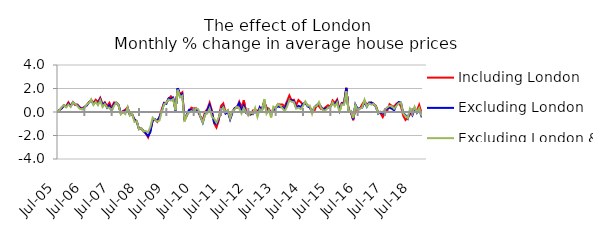
| Category | Including London | Excluding London | Excluding London & SE |
|---|---|---|---|
| 2005-07-01 | 0.004 | -0.027 | 0.069 |
| 2005-08-01 | 0.128 | 0.163 | 0.113 |
| 2005-09-01 | 0.297 | 0.295 | 0.421 |
| 2005-10-01 | 0.584 | 0.545 | 0.585 |
| 2005-11-01 | 0.486 | 0.433 | 0.401 |
| 2005-12-01 | 0.828 | 0.713 | 0.635 |
| 2006-01-01 | 0.509 | 0.504 | 0.432 |
| 2006-02-01 | 0.838 | 0.808 | 0.823 |
| 2006-03-01 | 0.586 | 0.674 | 0.681 |
| 2006-04-01 | 0.628 | 0.563 | 0.509 |
| 2006-05-01 | 0.405 | 0.361 | 0.266 |
| 2006-06-01 | 0.306 | 0.233 | 0.241 |
| 2006-07-01 | 0.429 | 0.392 | 0.321 |
| 2006-08-01 | 0.565 | 0.554 | 0.633 |
| 2006-09-01 | 0.835 | 0.786 | 0.762 |
| 2006-10-01 | 0.993 | 1.028 | 1.077 |
| 2006-11-01 | 0.798 | 0.657 | 0.597 |
| 2006-12-01 | 1.047 | 0.896 | 0.873 |
| 2007-01-01 | 0.861 | 0.675 | 0.579 |
| 2007-02-01 | 1.212 | 1.103 | 1.006 |
| 2007-03-01 | 0.649 | 0.564 | 0.427 |
| 2007-04-01 | 0.826 | 0.759 | 0.678 |
| 2007-05-01 | 0.491 | 0.363 | 0.375 |
| 2007-06-01 | 0.782 | 0.561 | 0.366 |
| 2007-07-01 | 0.32 | 0.1 | 0.07 |
| 2007-08-01 | 0.81 | 0.683 | 0.526 |
| 2007-09-01 | 0.786 | 0.789 | 0.799 |
| 2007-10-01 | 0.574 | 0.623 | 0.585 |
| 2007-11-01 | -0.113 | -0.077 | -0.206 |
| 2007-12-01 | 0.076 | 0.042 | -0.036 |
| 2008-01-01 | 0.196 | 0.057 | -0.181 |
| 2008-02-01 | 0.402 | 0.318 | 0.4 |
| 2008-03-01 | -0.271 | -0.253 | -0.302 |
| 2008-04-01 | -0.188 | -0.2 | -0.142 |
| 2008-05-01 | -0.619 | -0.654 | -0.845 |
| 2008-06-01 | -0.782 | -0.813 | -0.776 |
| 2008-07-01 | -1.451 | -1.459 | -1.469 |
| 2008-08-01 | -1.382 | -1.399 | -1.373 |
| 2008-09-01 | -1.671 | -1.607 | -1.657 |
| 2008-10-01 | -1.826 | -1.814 | -1.615 |
| 2008-11-01 | -2.159 | -2.057 | -1.722 |
| 2008-12-01 | -1.562 | -1.704 | -1.276 |
| 2009-01-01 | -0.738 | -0.696 | -0.476 |
| 2009-02-01 | -0.617 | -0.629 | -0.663 |
| 2009-03-01 | -0.835 | -0.775 | -0.813 |
| 2009-04-01 | -0.421 | -0.427 | -0.719 |
| 2009-05-01 | 0.239 | 0.032 | 0.055 |
| 2009-06-01 | 0.777 | 0.768 | 0.66 |
| 2009-07-01 | 0.802 | 0.701 | 0.8 |
| 2009-08-01 | 1.131 | 1.168 | 1.054 |
| 2009-09-01 | 1.337 | 1.113 | 0.972 |
| 2009-10-01 | 1.165 | 1.217 | 1.097 |
| 2009-11-01 | 0.197 | 0.118 | 0.156 |
| 2009-12-01 | 1.981 | 2.035 | 1.897 |
| 2010-01-01 | 1.519 | 1.363 | 1.249 |
| 2010-02-01 | 1.677 | 1.52 | 1.375 |
| 2010-03-01 | -0.627 | -0.692 | -0.795 |
| 2010-04-01 | -0.325 | -0.232 | -0.266 |
| 2010-05-01 | 0.094 | 0.19 | -0.033 |
| 2010-06-01 | 0.367 | 0.159 | 0.081 |
| 2010-07-01 | 0.291 | 0.119 | -0.034 |
| 2010-08-01 | 0.34 | 0.264 | 0.318 |
| 2010-09-01 | -0.022 | 0.097 | 0.241 |
| 2010-10-01 | -0.376 | -0.435 | -0.41 |
| 2010-11-01 | -0.713 | -0.899 | -0.896 |
| 2010-12-01 | 0.005 | -0.185 | -0.217 |
| 2011-01-01 | 0.246 | 0.156 | -0.125 |
| 2011-02-01 | 0.789 | 0.605 | 0.302 |
| 2011-03-01 | 0.128 | -0.038 | -0.411 |
| 2011-04-01 | -0.968 | -0.9 | -0.557 |
| 2011-05-01 | -1.323 | -1.037 | -0.907 |
| 2011-06-01 | -0.728 | -0.567 | -0.453 |
| 2011-07-01 | 0.512 | 0.242 | 0.099 |
| 2011-08-01 | 0.726 | 0.47 | 0.393 |
| 2011-09-01 | -0.007 | -0.138 | -0.009 |
| 2011-10-01 | 0.137 | 0.027 | 0.156 |
| 2011-11-01 | -0.567 | -0.635 | -0.55 |
| 2011-12-01 | 0.039 | -0.073 | 0.07 |
| 2012-01-01 | 0.326 | 0.325 | 0.217 |
| 2012-02-01 | 0.35 | 0.447 | 0.451 |
| 2012-03-01 | 0.876 | 0.755 | 0.302 |
| 2012-04-01 | 0.41 | 0.073 | -0.137 |
| 2012-05-01 | 0.988 | 0.555 | 0.346 |
| 2012-06-01 | 0.006 | -0.081 | 0.004 |
| 2012-07-01 | -0.085 | -0.158 | -0.308 |
| 2012-08-01 | -0.229 | -0.157 | -0.058 |
| 2012-09-01 | 0.128 | -0.186 | -0.139 |
| 2012-10-01 | 0.179 | 0.172 | 0.344 |
| 2012-11-01 | 0.065 | -0.249 | -0.418 |
| 2012-12-01 | 0.317 | 0.405 | 0.234 |
| 2013-01-01 | 0.353 | 0.115 | 0.095 |
| 2013-02-01 | 0.856 | 0.948 | 1.094 |
| 2013-03-01 | 0.386 | 0.079 | -0.146 |
| 2013-04-01 | 0.274 | 0.196 | 0.178 |
| 2013-05-01 | -0.099 | -0.23 | -0.468 |
| 2013-06-01 | 0.123 | 0.165 | 0.449 |
| 2013-07-01 | 0.372 | 0.338 | 0.307 |
| 2013-08-01 | 0.658 | 0.477 | 0.683 |
| 2013-09-01 | 0.643 | 0.413 | 0.532 |
| 2013-10-01 | 0.632 | 0.433 | 0.308 |
| 2013-11-01 | 0.471 | 0.192 | 0.067 |
| 2013-12-01 | 0.925 | 0.764 | 0.46 |
| 2014-01-01 | 1.406 | 1.032 | 0.997 |
| 2014-02-01 | 0.988 | 1.004 | 0.876 |
| 2014-03-01 | 1.041 | 0.92 | 0.836 |
| 2014-04-01 | 0.572 | 0.382 | 0.28 |
| 2014-05-01 | 1.019 | 0.524 | 0.359 |
| 2014-06-01 | 0.845 | 0.427 | 0.25 |
| 2014-07-01 | 0.633 | 0.685 | 0.514 |
| 2014-08-01 | 0.738 | 0.819 | 0.897 |
| 2014-09-01 | 0.591 | 0.475 | 0.536 |
| 2014-10-01 | 0.374 | 0.403 | 0.543 |
| 2014-11-01 | 0.005 | -0.008 | -0.158 |
| 2014-12-01 | 0.104 | 0.388 | 0.438 |
| 2015-01-01 | 0.566 | 0.596 | 0.531 |
| 2015-02-01 | 0.477 | 0.712 | 0.845 |
| 2015-03-01 | 0.246 | 0.42 | 0.32 |
| 2015-04-01 | 0.268 | 0.15 | 0.11 |
| 2015-05-01 | 0.427 | 0.324 | 0.171 |
| 2015-06-01 | 0.575 | 0.356 | 0.37 |
| 2015-07-01 | 0.419 | 0.456 | 0.42 |
| 2015-08-01 | 0.978 | 0.742 | 0.82 |
| 2015-09-01 | 0.752 | 0.658 | 0.479 |
| 2015-10-01 | 1.06 | 0.93 | 0.809 |
| 2015-11-01 | 0.234 | 0.111 | -0.034 |
| 2015-12-01 | 0.779 | 0.71 | 0.654 |
| 2016-01-01 | 0.813 | 0.679 | 0.611 |
| 2016-02-01 | 2.068 | 2.04 | 1.776 |
| 2016-03-01 | 0.187 | 0.064 | 0.072 |
| 2016-04-01 | -0.005 | 0.068 | 0.11 |
| 2016-05-01 | -0.701 | -0.612 | -0.52 |
| 2016-06-01 | 0.306 | 0.646 | 0.59 |
| 2016-07-01 | 0.133 | 0.264 | 0.142 |
| 2016-08-01 | 0.302 | 0.34 | 0.298 |
| 2016-09-01 | 0.654 | 0.381 | 0.399 |
| 2016-10-01 | 0.961 | 0.856 | 1.037 |
| 2016-11-01 | 0.631 | 0.45 | 0.474 |
| 2016-12-01 | 0.742 | 0.807 | 0.729 |
| 2017-01-01 | 0.813 | 0.789 | 0.628 |
| 2017-02-01 | 0.634 | 0.713 | 0.691 |
| 2017-03-01 | 0.538 | 0.426 | 0.479 |
| 2017-04-01 | -0.029 | -0.142 | -0.122 |
| 2017-05-01 | -0.082 | -0.004 | 0.041 |
| 2017-06-01 | -0.438 | -0.144 | -0.044 |
| 2017-07-01 | -0.102 | 0.164 | 0.229 |
| 2017-08-01 | 0.123 | 0.303 | 0.396 |
| 2017-09-01 | 0.661 | 0.362 | 0.523 |
| 2017-10-01 | 0.519 | 0.286 | 0.492 |
| 2017-11-01 | 0.45 | 0.146 | 0.279 |
| 2017-12-01 | 0.706 | 0.591 | 0.514 |
| 2018-01-01 | 0.815 | 0.84 | 0.741 |
| 2018-02-01 | 0.474 | 0.802 | 0.767 |
| 2018-03-01 | -0.313 | -0.097 | -0.13 |
| 2018-04-01 | -0.677 | -0.267 | -0.339 |
| 2018-05-01 | -0.496 | -0.557 | -0.524 |
| 2018-06-01 | -0.161 | 0.159 | 0.28 |
| 2018-07-01 | -0.263 | -0.255 | -0.097 |
| 2018-08-01 | 0.18 | 0.342 | 0.442 |
| 2018-09-01 | 0.103 | -0.073 | -0.022 |
| 2018-10-01 | 0.607 | 0.243 | 0.33 |
| 2018-11-01 | -0.059 | -0.361 | -0.291 |
| 2018-12-01 | -0.097 | -0.265 | -0.18 |
| 2019-01-01 | -0.178 | -0.309 | -0.271 |